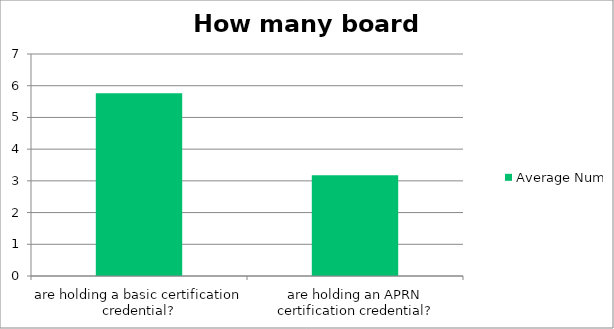
| Category | Average Number |
|---|---|
| are holding a basic certification credential? | 5.765 |
| are holding an APRN certification credential? | 3.176 |